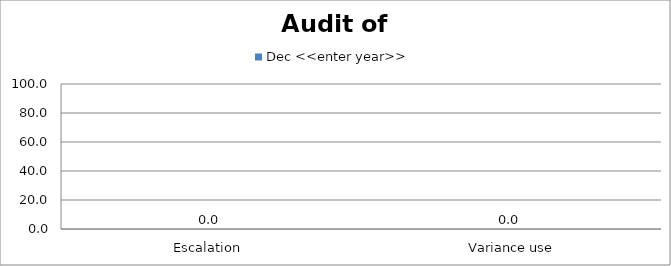
| Category | Dec <<enter year>> |
|---|---|
| Escalation  | 0 |
|  Variance use | 0 |